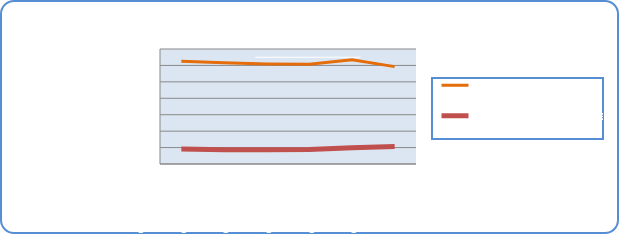
| Category | Motorin Türleri | Benzin Türleri |
|---|---|---|
| 6/17/19 | 62572266.496 | 9166918.976 |
| 6/18/19 | 61568837.165 | 8682860.249 |
| 6/19/19 | 60923385.326 | 8673079.119 |
| 6/20/19 | 60777649.67 | 8846087.37 |
| 6/21/19 | 63395468.583 | 9904634.861 |
| 6/22/19 | 59276269.39 | 10695636.436 |